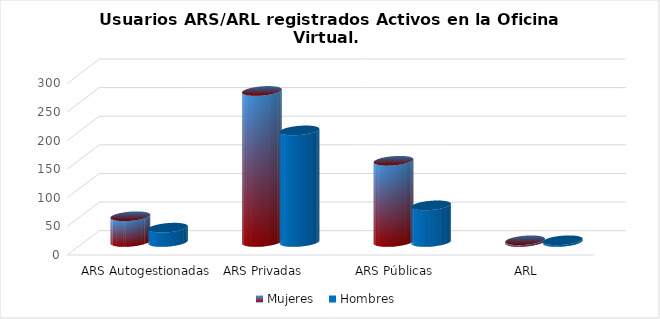
| Category | Mujeres | Hombres |
|---|---|---|
| ARS Autogestionadas | 45 | 25 |
| ARS Privadas | 264 | 195 |
| ARS Públicas | 142 | 64 |
| ARL | 3 | 3 |